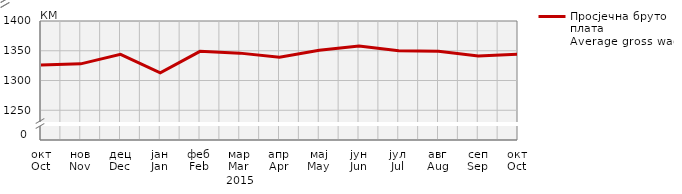
| Category | Просјечна бруто плата
Average gross wage |
|---|---|
| окт
Oct | 1326 |
| нов
Nov | 1328 |
| дец
Dec | 1344 |
| јан
Jan | 1313 |
| феб
Feb | 1349 |
| мар
Mar | 1346 |
| апр
Apr | 1339 |
| мај
May | 1351 |
| јун
Jun | 1358 |
| јул
Jul | 1350 |
| авг
Aug | 1349 |
| сеп
Sep | 1341 |
| окт
Oct | 1344 |